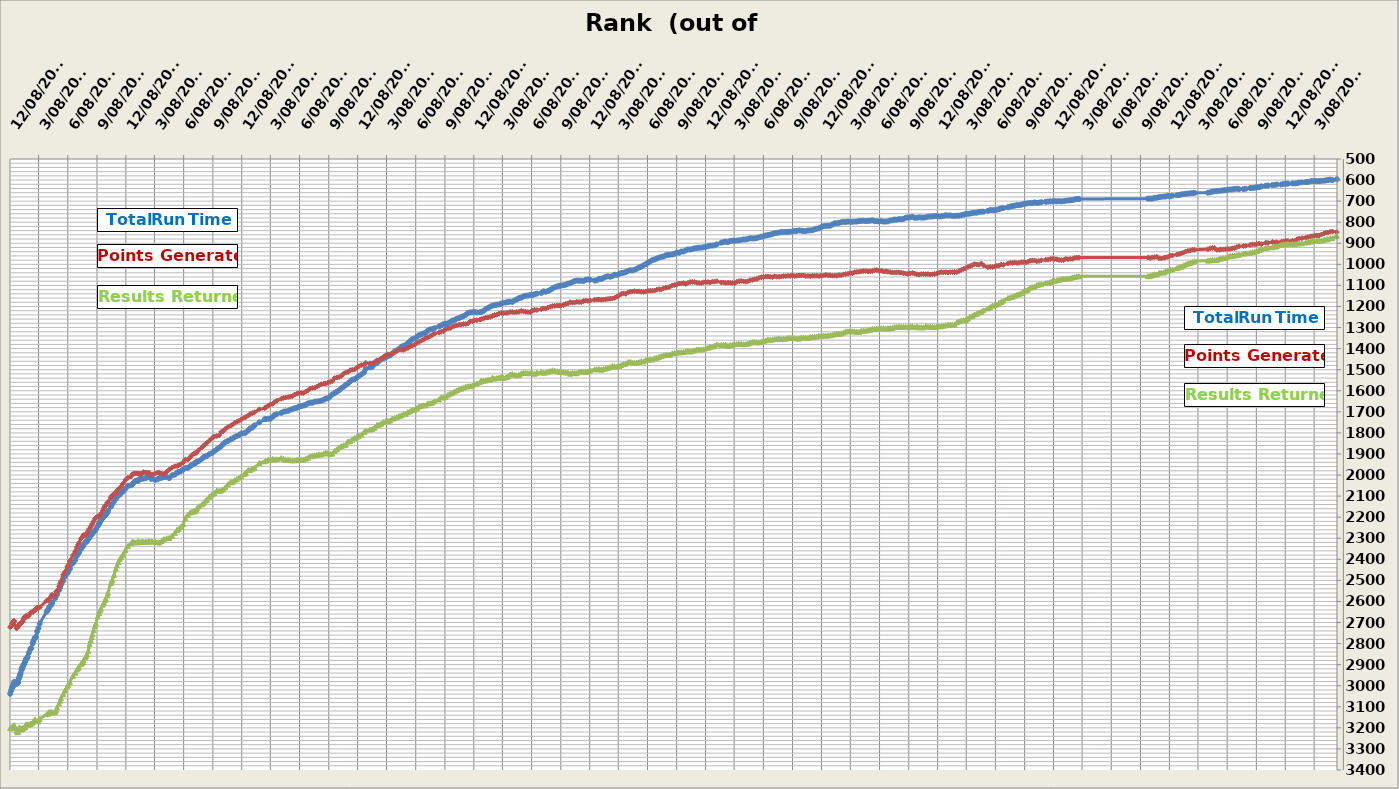
| Category | Series 0 | Series 1 | Series 2 |
|---|---|---|---|
| 2012-12-08 | 3038 | 2722 | 3201 |
| 2012-12-11 | 3024 | 2717 | 3199 |
| 2012-12-13 | 3014 | 2713 | 3202 |
| 2012-12-15 | 3005 | 2705 | 3197 |
| 2012-12-16 | 3003 | 2704 | 3196 |
| 2012-12-17 | 3002 | 2701 | 3196 |
| 2012-12-18 | 2995 | 2697 | 3193 |
| 2012-12-19 | 2992 | 2693 | 3191 |
| 2012-12-20 | 2991 | 2697 | 3190 |
| 2012-12-21 | 2981 | 2693 | 3187 |
| 2012-12-28 | 2992 | 2728 | 3215 |
| 2012-12-31 | 2988 | 2721 | 3220 |
| 2013-01-01 | 2984 | 2722 | 3220 |
| 2013-01-02 | 2983 | 2716 | 3215 |
| 2013-01-04 | 2967 | 2714 | 3202 |
| 2013-01-06 | 2959 | 2710 | 3199 |
| 2013-01-07 | 2957 | 2709 | 3199 |
| 2013-01-08 | 2948 | 2709 | 3201 |
| 2013-01-10 | 2940 | 2701 | 3206 |
| 2013-01-13 | 2924 | 2697 | 3207 |
| 2013-01-14 | 2920 | 2700 | 3206 |
| 2013-01-15 | 2915 | 2699 | 3202 |
| 2013-01-16 | 2912 | 2694 | 3203 |
| 2013-01-19 | 2901 | 2684 | 3199 |
| 2013-01-21 | 2897 | 2675 | 3199 |
| 2013-01-24 | 2887 | 2678 | 3195 |
| 2013-01-25 | 2882 | 2674 | 3195 |
| 2013-01-27 | 2874 | 2669 | 3184 |
| 2013-01-29 | 2871 | 2667 | 3185 |
| 2013-02-01 | 2863 | 2671 | 3183 |
| 2013-02-05 | 2843 | 2668 | 3185 |
| 2013-02-10 | 2825 | 2654 | 3179 |
| 2013-02-12 | 2822 | 2652 | 3181 |
| 2013-02-17 | 2799 | 2651 | 3175 |
| 2013-02-19 | 2788 | 2645 | 3169 |
| 2013-02-23 | 2776 | 2641 | 3163 |
| 2013-02-24 | 2774 | 2639 | 3160 |
| 2013-02-26 | 2769 | 2640 | 3164 |
| 2013-03-03 | 2742 | 2629 | 3167 |
| 2013-03-07 | 2727 | 2630 | 3169 |
| 2013-03-11 | 2705 | 2628 | 3158 |
| 2013-04-02 | 2648 | 2596 | 3135 |
| 2013-04-07 | 2638 | 2595 | 3133 |
| 2013-04-10 | 2628 | 2587 | 3125 |
| 2013-04-16 | 2616 | 2579 | 3124 |
| 2013-04-17 | 2614 | 2575 | 3126 |
| 2013-04-19 | 2607 | 2568 | 3128 |
| 2013-04-29 | 2584 | 2568 | 3124 |
| 2013-05-02 | 2572 | 2554 | 3116 |
| 2013-05-05 | 2566 | 2549 | 3103 |
| 2013-05-11 | 2545 | 2528 | 3085 |
| 2013-05-14 | 2534 | 2516 | 3071 |
| 2013-05-17 | 2521 | 2504 | 3059 |
| 2013-05-24 | 2503 | 2473 | 3040 |
| 2013-05-29 | 2482 | 2461 | 3023 |
| 2013-06-06 | 2467 | 2436 | 3003 |
| 2013-06-09 | 2460 | 2428 | 2995 |
| 2013-06-14 | 2446 | 2407 | 2982 |
| 2013-06-24 | 2418 | 2380 | 2953 |
| 2013-07-01 | 2403 | 2361 | 2938 |
| 2013-07-06 | 2384 | 2343 | 2923 |
| 2013-07-10 | 2374 | 2331 | 2916 |
| 2013-07-13 | 2367 | 2322 | 2909 |
| 2013-07-19 | 2351 | 2302 | 2896 |
| 2013-07-22 | 2344 | 2297 | 2893 |
| 2013-07-25 | 2338 | 2291 | 2888 |
| 2013-07-27 | 2333 | 2285 | 2880 |
| 2013-08-02 | 2318 | 2286 | 2865 |
| 2013-08-04 | 2319 | 2283 | 2859 |
| 2013-08-07 | 2314 | 2275 | 2851 |
| 2013-08-11 | 2304 | 2264 | 2834 |
| 2013-08-15 | 2296 | 2254 | 2802 |
| 2013-08-19 | 2284 | 2246 | 2783 |
| 2013-08-22 | 2282 | 2238 | 2769 |
| 2013-08-24 | 2277 | 2231 | 2755 |
| 2013-08-28 | 2269 | 2220 | 2736 |
| 2013-09-01 | 2266 | 2207 | 2717 |
| 2013-09-04 | 2257 | 2203 | 2704 |
| 2013-09-10 | 2242 | 2196 | 2671 |
| 2013-09-14 | 2232 | 2197 | 2655 |
| 2013-09-17 | 2223 | 2191 | 2643 |
| 2013-09-20 | 2215 | 2183 | 2634 |
| 2013-09-26 | 2204 | 2168 | 2615 |
| 2013-09-29 | 2198 | 2157 | 2606 |
| 2013-10-02 | 2192 | 2148 | 2595 |
| 2013-10-05 | 2189 | 2145 | 2587 |
| 2013-10-10 | 2179 | 2132 | 2571 |
| 2013-10-12 | 2171 | 2129 | 2559 |
| 2013-10-21 | 2150 | 2108 | 2513 |
| 2013-10-23 | 2142 | 2101 | 2505 |
| 2013-10-26 | 2136 | 2098 | 2499 |
| 2013-10-31 | 2125 | 2089 | 2475 |
| 2013-11-06 | 2113 | 2086 | 2444 |
| 2013-11-10 | 2103 | 2073 | 2429 |
| 2013-11-14 | 2097 | 2068 | 2413 |
| 2013-11-18 | 2093 | 2063 | 2399 |
| 2013-11-23 | 2084 | 2054 | 2390 |
| 2013-11-28 | 2079 | 2041 | 2378 |
| 2013-12-06 | 2065 | 2023 | 2356 |
| 2013-12-14 | 2052 | 2013 | 2337 |
| 2013-12-24 | 2048 | 2007 | 2323 |
| 2013-12-28 | 2043 | 1997 | 2316 |
| 2014-01-02 | 2035 | 1992 | 2318 |
| 2014-01-08 | 2027 | 1992 | 2320 |
| 2014-01-14 | 2028 | 1993 | 2314 |
| 2014-01-19 | 2019 | 1992 | 2318 |
| 2014-01-22 | 2020 | 1995 | 2319 |
| 2014-01-27 | 2017 | 1994 | 2316 |
| 2014-02-01 | 2017 | 1986 | 2316 |
| 2014-02-07 | 2015 | 1988 | 2317 |
| 2014-02-12 | 2012 | 1990 | 2317 |
| 2014-02-18 | 2007 | 1989 | 2314 |
| 2014-02-25 | 2018 | 2000 | 2315 |
| 2014-03-01 | 2016 | 1998 | 2316 |
| 2014-03-10 | 2023 | 1993 | 2316 |
| 2014-03-18 | 2020 | 1988 | 2319 |
| 2014-03-23 | 2014 | 1990 | 2320 |
| 2014-03-30 | 2013 | 1993 | 2313 |
| 2014-04-06 | 2010 | 1996 | 2304 |
| 2014-04-15 | 2010 | 1985 | 2300 |
| 2014-04-23 | 2015 | 1974 | 2299 |
| 2014-05-02 | 2001 | 1965 | 2289 |
| 2014-05-11 | 1998 | 1958 | 2274 |
| 2014-05-18 | 1988 | 1957 | 2260 |
| 2014-05-23 | 1986 | 1953 | 2257 |
| 2014-05-29 | 1983 | 1949 | 2247 |
| 2014-06-06 | 1974 | 1939 | 2233 |
| 2014-06-13 | 1967 | 1926 | 2204 |
| 2014-06-21 | 1966 | 1927 | 2189 |
| 2014-06-28 | 1958 | 1915 | 2178 |
| 2014-07-04 | 1951 | 1905 | 2174 |
| 2014-07-10 | 1948 | 1899 | 2172 |
| 2014-07-13 | 1943 | 1897 | 2172 |
| 2014-07-17 | 1939 | 1895 | 2165 |
| 2014-07-20 | 1936 | 1889 | 2157 |
| 2014-07-26 | 1933 | 1880 | 2148 |
| 2014-08-05 | 1922 | 1868 | 2139 |
| 2014-08-10 | 1915 | 1860 | 2131 |
| 2014-08-16 | 1911 | 1851 | 2121 |
| 2014-08-20 | 1909 | 1847 | 2117 |
| 2014-08-28 | 1900 | 1836 | 2103 |
| 2014-09-05 | 1895 | 1825 | 2092 |
| 2014-09-12 | 1887 | 1817 | 2086 |
| 2014-09-20 | 1878 | 1815 | 2073 |
| 2014-09-27 | 1871 | 1812 | 2075 |
| 2014-10-04 | 1862 | 1795 | 2073 |
| 2014-10-10 | 1853 | 1793 | 2068 |
| 2014-10-17 | 1844 | 1780 | 2058 |
| 2014-10-25 | 1838 | 1772 | 2044 |
| 2014-11-03 | 1831 | 1765 | 2032 |
| 2014-11-08 | 1827 | 1761 | 2034 |
| 2014-11-15 | 1820 | 1752 | 2025 |
| 2014-11-22 | 1815 | 1747 | 2019 |
| 2014-11-29 | 1811 | 1743 | 2012 |
| 2014-12-06 | 1803 | 1736 | 2006 |
| 2014-12-16 | 1801 | 1727 | 1995 |
| 2014-12-20 | 1798 | 1725 | 1989 |
| 2014-12-28 | 1788 | 1718 | 1976 |
| 2015-01-03 | 1779 | 1710 | 1976 |
| 2015-01-10 | 1775 | 1706 | 1970 |
| 2015-01-17 | 1764 | 1702 | 1966 |
| 2015-02-01 | 1750 | 1688 | 1943 |
| 2015-02-18 | 1735 | 1683 | 1935 |
| 2015-02-21 | 1734 | 1679 | 1932 |
| 2015-02-28 | 1733 | 1672 | 1927 |
| 2015-03-07 | 1733 | 1666 | 1928 |
| 2015-03-15 | 1724 | 1662 | 1923 |
| 2015-03-21 | 1715 | 1654 | 1926 |
| 2015-03-28 | 1711 | 1647 | 1925 |
| 2015-04-11 | 1705 | 1638 | 1919 |
| 2015-04-18 | 1699 | 1634 | 1923 |
| 2015-04-25 | 1698 | 1632 | 1928 |
| 2015-05-03 | 1695 | 1630 | 1927 |
| 2015-05-09 | 1690 | 1628 | 1929 |
| 2015-05-16 | 1687 | 1626 | 1930 |
| 2015-05-23 | 1683 | 1618 | 1930 |
| 2015-05-30 | 1681 | 1614 | 1927 |
| 2015-06-06 | 1675 | 1611 | 1927 |
| 2015-06-13 | 1673 | 1610 | 1927 |
| 2015-06-20 | 1670 | 1611 | 1926 |
| 2015-06-27 | 1667 | 1604 | 1922 |
| 2015-07-04 | 1660 | 1598 | 1918 |
| 2015-07-11 | 1657 | 1590 | 1911 |
| 2015-07-18 | 1657 | 1587 | 1908 |
| 2015-07-25 | 1652 | 1586 | 1907 |
| 2015-08-01 | 1651 | 1581 | 1905 |
| 2015-08-08 | 1650 | 1575 | 1902 |
| 2015-08-15 | 1647 | 1569 | 1902 |
| 2015-08-23 | 1643 | 1566 | 1898 |
| 2015-08-29 | 1637 | 1566 | 1894 |
| 2015-09-05 | 1636 | 1562 | 1896 |
| 2015-09-12 | 1627 | 1558 | 1900 |
| 2015-09-19 | 1617 | 1554 | 1898 |
| 2015-09-26 | 1612 | 1540 | 1886 |
| 2015-10-03 | 1604 | 1537 | 1878 |
| 2015-10-10 | 1598 | 1535 | 1869 |
| 2015-10-17 | 1588 | 1530 | 1863 |
| 2015-10-24 | 1581 | 1519 | 1859 |
| 2015-10-31 | 1572 | 1513 | 1856 |
| 2015-11-07 | 1565 | 1511 | 1841 |
| 2015-11-14 | 1556 | 1502 | 1839 |
| 2015-11-21 | 1547 | 1500 | 1831 |
| 2015-11-28 | 1545 | 1499 | 1824 |
| 2015-12-05 | 1538 | 1490 | 1819 |
| 2015-12-12 | 1529 | 1483 | 1813 |
| 2015-12-20 | 1522 | 1478 | 1807 |
| 2015-12-28 | 1513 | 1475 | 1796 |
| 2016-01-02 | 1496 | 1468 | 1789 |
| 2016-01-16 | 1489 | 1470 | 1784 |
| 2016-01-23 | 1486 | 1470 | 1781 |
| 2016-01-30 | 1473 | 1464 | 1775 |
| 2016-02-06 | 1469 | 1456 | 1763 |
| 2016-02-13 | 1459 | 1455 | 1761 |
| 2016-02-20 | 1451 | 1447 | 1756 |
| 2016-02-27 | 1446 | 1439 | 1748 |
| 2016-03-05 | 1442 | 1432 | 1744 |
| 2016-03-12 | 1435 | 1427 | 1743 |
| 2016-03-19 | 1432 | 1427 | 1741 |
| 2016-03-26 | 1423 | 1423 | 1732 |
| 2016-04-02 | 1413 | 1419 | 1730 |
| 2016-04-09 | 1408 | 1411 | 1725 |
| 2016-04-16 | 1401 | 1404 | 1720 |
| 2016-04-23 | 1392 | 1405 | 1717 |
| 2016-04-30 | 1386 | 1406 | 1711 |
| 2016-05-07 | 1384 | 1401 | 1710 |
| 2016-05-14 | 1373 | 1397 | 1701 |
| 2016-05-21 | 1364 | 1388 | 1697 |
| 2016-05-28 | 1355 | 1386 | 1690 |
| 2016-06-04 | 1352 | 1381 | 1690 |
| 2016-06-11 | 1344 | 1374 | 1683 |
| 2016-06-18 | 1336 | 1368 | 1675 |
| 2016-06-25 | 1333 | 1362 | 1671 |
| 2016-07-02 | 1328 | 1357 | 1669 |
| 2016-07-09 | 1324 | 1349 | 1669 |
| 2016-07-16 | 1314 | 1347 | 1660 |
| 2016-07-23 | 1309 | 1340 | 1659 |
| 2016-07-30 | 1307 | 1335 | 1656 |
| 2016-08-06 | 1303 | 1329 | 1650 |
| 2016-08-20 | 1295 | 1324 | 1641 |
| 2016-08-27 | 1290 | 1320 | 1631 |
| 2016-09-03 | 1284 | 1317 | 1631 |
| 2016-09-10 | 1282 | 1307 | 1630 |
| 2016-09-17 | 1280 | 1304 | 1619 |
| 2016-09-24 | 1274 | 1303 | 1614 |
| 2016-10-01 | 1267 | 1296 | 1610 |
| 2016-10-08 | 1264 | 1292 | 1603 |
| 2016-10-15 | 1258 | 1289 | 1598 |
| 2016-10-22 | 1255 | 1286 | 1593 |
| 2016-10-29 | 1250 | 1286 | 1590 |
| 2016-11-05 | 1246 | 1283 | 1585 |
| 2016-11-12 | 1240 | 1283 | 1580 |
| 2016-11-19 | 1231 | 1280 | 1579 |
| 2016-11-26 | 1228 | 1271 | 1578 |
| 2016-12-03 | 1227 | 1270 | 1575 |
| 2016-12-10 | 1226 | 1266 | 1569 |
| 2016-12-17 | 1228 | 1265 | 1565 |
| 2016-12-27 | 1227 | 1262 | 1559 |
| 2016-12-31 | 1226 | 1260 | 1552 |
| 2017-01-07 | 1221 | 1257 | 1552 |
| 2017-01-14 | 1213 | 1253 | 1551 |
| 2017-01-21 | 1207 | 1252 | 1547 |
| 2017-01-28 | 1201 | 1250 | 1547 |
| 2017-02-04 | 1196 | 1245 | 1538 |
| 2017-02-11 | 1194 | 1240 | 1542 |
| 2017-02-18 | 1192 | 1239 | 1540 |
| 2017-02-25 | 1190 | 1234 | 1538 |
| 2017-03-04 | 1186 | 1230 | 1535 |
| 2017-03-11 | 1182 | 1232 | 1539 |
| 2017-03-19 | 1181 | 1231 | 1536 |
| 2017-03-25 | 1179 | 1230 | 1532 |
| 2017-04-01 | 1177 | 1226 | 1523 |
| 2017-04-08 | 1178 | 1226 | 1521 |
| 2017-04-15 | 1171 | 1228 | 1524 |
| 2017-04-22 | 1166 | 1226 | 1527 |
| 2017-04-29 | 1160 | 1225 | 1525 |
| 2017-05-06 | 1158 | 1221 | 1518 |
| 2017-05-13 | 1152 | 1223 | 1514 |
| 2017-05-20 | 1149 | 1225 | 1515 |
| 2017-05-27 | 1148 | 1226 | 1517 |
| 2017-06-03 | 1145 | 1227 | 1516 |
| 2017-06-10 | 1146 | 1220 | 1516 |
| 2017-06-17 | 1142 | 1216 | 1519 |
| 2017-06-24 | 1139 | 1217 | 1514 |
| 2017-07-08 | 1136 | 1213 | 1512 |
| 2017-07-15 | 1128 | 1209 | 1514 |
| 2017-07-22 | 1130 | 1210 | 1513 |
| 2017-07-29 | 1127 | 1205 | 1510 |
| 2017-08-05 | 1121 | 1202 | 1507 |
| 2017-08-12 | 1115 | 1198 | 1503 |
| 2017-08-19 | 1109 | 1197 | 1504 |
| 2017-08-26 | 1105 | 1196 | 1508 |
| 2017-09-02 | 1102 | 1196 | 1510 |
| 2017-09-07 | 1101 | 1196 | 1511 |
| 2017-09-16 | 1099 | 1193 | 1511 |
| 2017-09-23 | 1097 | 1188 | 1513 |
| 2017-09-30 | 1092 | 1185 | 1513 |
| 2017-10-07 | 1089 | 1180 | 1519 |
| 2017-10-14 | 1085 | 1181 | 1515 |
| 2017-10-21 | 1079 | 1181 | 1515 |
| 2017-10-28 | 1077 | 1178 | 1517 |
| 2017-11-04 | 1078 | 1179 | 1509 |
| 2017-11-11 | 1078 | 1179 | 1508 |
| 2017-11-18 | 1079 | 1174 | 1510 |
| 2017-11-25 | 1073 | 1172 | 1510 |
| 2017-12-02 | 1072 | 1174 | 1508 |
| 2017-12-09 | 1073 | 1172 | 1504 |
| 2017-12-23 | 1077 | 1168 | 1498 |
| 2017-12-30 | 1076 | 1167 | 1498 |
| 2018-01-06 | 1069 | 1167 | 1497 |
| 2018-01-13 | 1070 | 1168 | 1500 |
| 2018-01-20 | 1064 | 1167 | 1496 |
| 2018-01-27 | 1059 | 1166 | 1494 |
| 2018-02-03 | 1057 | 1164 | 1491 |
| 2018-02-10 | 1059 | 1163 | 1488 |
| 2018-02-17 | 1056 | 1162 | 1482 |
| 2018-02-24 | 1049 | 1159 | 1484 |
| 2018-03-03 | 1050 | 1154 | 1485 |
| 2018-03-10 | 1046 | 1147 | 1483 |
| 2018-03-17 | 1041 | 1140 | 1478 |
| 2018-03-24 | 1040 | 1138 | 1473 |
| 2018-03-31 | 1037 | 1140 | 1471 |
| 2018-04-07 | 1031 | 1133 | 1464 |
| 2018-04-14 | 1028 | 1130 | 1463 |
| 2018-04-21 | 1029 | 1129 | 1466 |
| 2018-04-28 | 1025 | 1127 | 1467 |
| 2018-05-05 | 1021 | 1129 | 1466 |
| 2018-05-12 | 1015 | 1128 | 1464 |
| 2018-05-19 | 1011 | 1130 | 1460 |
| 2018-05-26 | 1005 | 1131 | 1461 |
| 2018-06-02 | 999 | 1129 | 1454 |
| 2018-06-09 | 993 | 1126 | 1453 |
| 2018-06-16 | 986 | 1125 | 1450 |
| 2018-06-23 | 980 | 1125 | 1452 |
| 2018-06-30 | 977 | 1124 | 1445 |
| 2018-07-07 | 972 | 1120 | 1443 |
| 2018-07-14 | 968 | 1118 | 1439 |
| 2018-07-21 | 965 | 1119 | 1436 |
| 2018-07-28 | 963 | 1114 | 1432 |
| 2018-08-04 | 957 | 1111 | 1429 |
| 2018-08-11 | 955 | 1109 | 1430 |
| 2018-08-18 | 954 | 1106 | 1428 |
| 2018-08-25 | 953 | 1100 | 1422 |
| 2018-09-01 | 950 | 1098 | 1421 |
| 2018-09-08 | 944 | 1095 | 1418 |
| 2018-09-15 | 945 | 1091 | 1418 |
| 2018-09-22 | 939 | 1091 | 1417 |
| 2018-09-29 | 939 | 1089 | 1416 |
| 2018-10-06 | 934 | 1093 | 1413 |
| 2018-10-13 | 929 | 1088 | 1411 |
| 2018-10-20 | 930 | 1084 | 1414 |
| 2018-10-27 | 927 | 1083 | 1410 |
| 2018-11-03 | 924 | 1084 | 1408 |
| 2018-11-10 | 923 | 1087 | 1404 |
| 2018-11-17 | 921 | 1088 | 1404 |
| 2018-11-24 | 921 | 1089 | 1404 |
| 2018-12-01 | 919 | 1085 | 1403 |
| 2018-12-08 | 917 | 1085 | 1398 |
| 2018-12-15 | 914 | 1084 | 1396 |
| 2018-12-22 | 911 | 1086 | 1392 |
| 2018-12-29 | 911 | 1082 | 1390 |
| 2019-01-05 | 910 | 1082 | 1387 |
| 2019-01-12 | 905 | 1080 | 1380 |
| 2019-01-26 | 897 | 1086 | 1382 |
| 2019-02-02 | 894 | 1086 | 1383 |
| 2019-02-09 | 892 | 1088 | 1382 |
| 2019-02-16 | 895 | 1087 | 1387 |
| 2019-02-23 | 889 | 1087 | 1383 |
| 2019-03-02 | 888 | 1088 | 1382 |
| 2019-03-09 | 888 | 1090 | 1379 |
| 2019-03-16 | 887 | 1083 | 1378 |
| 2019-03-23 | 886 | 1080 | 1377 |
| 2019-03-30 | 884 | 1079 | 1378 |
| 2019-04-06 | 882 | 1081 | 1379 |
| 2019-04-13 | 882 | 1082 | 1378 |
| 2019-04-20 | 879 | 1080 | 1376 |
| 2019-04-27 | 876 | 1075 | 1372 |
| 2019-05-04 | 877 | 1074 | 1369 |
| 2019-05-11 | 877 | 1071 | 1368 |
| 2019-05-18 | 875 | 1070 | 1370 |
| 2019-05-25 | 872 | 1064 | 1370 |
| 2019-06-01 | 869 | 1061 | 1367 |
| 2019-06-08 | 867 | 1060 | 1363 |
| 2019-06-15 | 863 | 1058 | 1361 |
| 2019-06-22 | 861 | 1058 | 1357 |
| 2019-06-29 | 859 | 1059 | 1358 |
| 2019-07-06 | 856 | 1061 | 1357 |
| 2019-07-13 | 852 | 1057 | 1354 |
| 2019-07-20 | 851 | 1059 | 1354 |
| 2019-07-27 | 849 | 1059 | 1351 |
| 2019-08-03 | 846 | 1058 | 1354 |
| 2019-08-10 | 847 | 1056 | 1352 |
| 2019-08-17 | 846 | 1056 | 1353 |
| 2019-08-24 | 846 | 1055 | 1349 |
| 2019-08-31 | 845 | 1055 | 1349 |
| 2019-09-07 | 844 | 1052 | 1350 |
| 2019-09-14 | 842 | 1056 | 1349 |
| 2019-09-21 | 841 | 1054 | 1352 |
| 2019-09-28 | 839 | 1053 | 1352 |
| 2019-10-05 | 840 | 1053 | 1347 |
| 2019-10-12 | 842 | 1052 | 1348 |
| 2019-10-19 | 842 | 1056 | 1349 |
| 2019-10-26 | 839 | 1055 | 1349 |
| 2019-11-02 | 839 | 1056 | 1345 |
| 2019-11-09 | 838 | 1054 | 1345 |
| 2019-11-16 | 834 | 1054 | 1343 |
| 2019-11-23 | 831 | 1054 | 1343 |
| 2019-11-30 | 829 | 1056 | 1340 |
| 2019-12-07 | 823 | 1053 | 1340 |
| 2019-12-14 | 819 | 1053 | 1337 |
| 2019-12-21 | 818 | 1050 | 1339 |
| 2019-12-28 | 817 | 1052 | 1337 |
| 2020-01-04 | 817 | 1052 | 1337 |
| 2020-01-11 | 811 | 1054 | 1334 |
| 2020-01-18 | 805 | 1053 | 1332 |
| 2020-01-25 | 805 | 1054 | 1329 |
| 2020-02-01 | 803 | 1051 | 1330 |
| 2020-02-08 | 800 | 1052 | 1328 |
| 2020-02-15 | 798 | 1048 | 1323 |
| 2020-02-22 | 799 | 1046 | 1318 |
| 2020-02-29 | 797 | 1045 | 1318 |
| 2020-03-07 | 798 | 1041 | 1316 |
| 2020-03-14 | 798 | 1042 | 1318 |
| 2020-03-21 | 797 | 1037 | 1318 |
| 2020-03-28 | 797 | 1036 | 1320 |
| 2020-04-04 | 795 | 1035 | 1321 |
| 2020-04-11 | 794 | 1034 | 1315 |
| 2020-04-18 | 793 | 1032 | 1314 |
| 2020-04-25 | 795 | 1031 | 1314 |
| 2020-05-02 | 794 | 1034 | 1313 |
| 2020-05-09 | 793 | 1033 | 1311 |
| 2020-05-16 | 791 | 1032 | 1306 |
| 2020-05-23 | 795 | 1028 | 1306 |
| 2020-05-30 | 795 | 1027 | 1305 |
| 2020-06-06 | 797 | 1031 | 1304 |
| 2020-06-13 | 795 | 1030 | 1303 |
| 2020-06-20 | 797 | 1034 | 1303 |
| 2020-06-27 | 797 | 1033 | 1305 |
| 2020-07-04 | 796 | 1035 | 1303 |
| 2020-07-11 | 792 | 1037 | 1303 |
| 2020-07-18 | 791 | 1039 | 1302 |
| 2020-07-25 | 787 | 1039 | 1297 |
| 2020-08-01 | 788 | 1038 | 1297 |
| 2020-08-08 | 785 | 1038 | 1296 |
| 2020-08-15 | 786 | 1039 | 1297 |
| 2020-08-22 | 784 | 1042 | 1296 |
| 2020-08-29 | 779 | 1044 | 1297 |
| 2020-09-05 | 778 | 1045 | 1298 |
| 2020-09-12 | 777 | 1043 | 1296 |
| 2020-09-19 | 774 | 1041 | 1294 |
| 2020-09-26 | 779 | 1044 | 1298 |
| 2020-10-03 | 779 | 1047 | 1295 |
| 2020-10-10 | 777 | 1049 | 1299 |
| 2020-10-17 | 778 | 1046 | 1298 |
| 2020-10-24 | 778 | 1046 | 1299 |
| 2020-10-31 | 777 | 1047 | 1294 |
| 2020-11-07 | 774 | 1046 | 1296 |
| 2020-11-14 | 773 | 1048 | 1295 |
| 2020-11-21 | 773 | 1047 | 1297 |
| 2020-11-28 | 771 | 1046 | 1298 |
| 2020-12-05 | 771 | 1043 | 1296 |
| 2020-12-12 | 773 | 1040 | 1294 |
| 2020-12-19 | 772 | 1037 | 1294 |
| 2020-12-26 | 771 | 1038 | 1291 |
| 2021-01-02 | 767 | 1037 | 1289 |
| 2021-01-09 | 768 | 1039 | 1286 |
| 2021-01-16 | 768 | 1037 | 1286 |
| 2021-01-23 | 770 | 1037 | 1286 |
| 2021-01-30 | 770 | 1036 | 1285 |
| 2021-02-06 | 769 | 1037 | 1275 |
| 2021-02-13 | 769 | 1032 | 1271 |
| 2021-02-20 | 767 | 1026 | 1267 |
| 2021-02-27 | 764 | 1022 | 1265 |
| 2021-03-06 | 761 | 1018 | 1265 |
| 2021-03-13 | 760 | 1012 | 1258 |
| 2021-03-20 | 759 | 1008 | 1248 |
| 2021-03-27 | 756 | 1004 | 1245 |
| 2021-04-03 | 755 | 999 | 1238 |
| 2021-04-10 | 755 | 1001 | 1234 |
| 2021-04-17 | 751 | 1002 | 1228 |
| 2021-04-24 | 750 | 996 | 1225 |
| 2021-05-01 | 750 | 1005 | 1218 |
| 2021-05-15 | 746 | 1014 | 1209 |
| 2021-05-22 | 742 | 1012 | 1203 |
| 2021-05-29 | 743 | 1013 | 1196 |
| 2021-06-05 | 743 | 1010 | 1193 |
| 2021-06-12 | 741 | 1007 | 1191 |
| 2021-06-19 | 738 | 1006 | 1183 |
| 2021-06-26 | 734 | 1001 | 1178 |
| 2021-07-03 | 733 | 1002 | 1172 |
| 2021-07-17 | 729 | 996 | 1160 |
| 2021-07-24 | 726 | 993 | 1157 |
| 2021-07-31 | 723 | 993 | 1154 |
| 2021-08-07 | 722 | 991 | 1149 |
| 2021-08-14 | 719 | 994 | 1144 |
| 2021-08-21 | 719 | 993 | 1141 |
| 2021-08-28 | 717 | 990 | 1137 |
| 2021-09-04 | 713 | 990 | 1128 |
| 2021-09-11 | 712 | 991 | 1124 |
| 2021-09-18 | 710 | 988 | 1120 |
| 2021-09-25 | 709 | 983 | 1110 |
| 2021-10-02 | 709 | 982 | 1109 |
| 2021-10-09 | 706 | 982 | 1105 |
| 2021-10-16 | 708 | 985 | 1098 |
| 2021-10-23 | 707 | 984 | 1096 |
| 2021-10-30 | 705 | 981 | 1094 |
| 2021-11-13 | 703 | 978 | 1089 |
| 2021-11-20 | 702 | 978 | 1088 |
| 2021-11-27 | 701 | 975 | 1085 |
| 2021-12-04 | 701 | 973 | 1079 |
| 2021-12-11 | 700 | 975 | 1079 |
| 2021-12-18 | 701 | 976 | 1075 |
| 2021-12-25 | 700 | 979 | 1073 |
| 2022-01-01 | 701 | 980 | 1070 |
| 2022-01-08 | 700 | 980 | 1068 |
| 2022-01-15 | 698 | 974 | 1067 |
| 2022-01-22 | 697 | 976 | 1067 |
| 2022-01-29 | 696 | 974 | 1066 |
| 2022-02-05 | 695 | 974 | 1062 |
| 2022-02-12 | 692 | 969 | 1060 |
| 2022-02-19 | 690 | 968 | 1057 |
| 2022-02-26 | 690 | 968 | 1057 |
| 2022-10-01 | 688 | 968 | 1056 |
| 2022-10-08 | 688 | 970 | 1055 |
| 2022-10-15 | 688 | 967 | 1051 |
| 2022-10-22 | 684 | 966 | 1047 |
| 2022-10-29 | 684 | 964 | 1048 |
| 2022-11-05 | 681 | 971 | 1040 |
| 2022-11-12 | 680 | 972 | 1039 |
| 2022-11-21 | 678 | 969 | 1038 |
| 2022-11-26 | 678 | 967 | 1033 |
| 2022-12-03 | 675 | 965 | 1030 |
| 2022-12-10 | 677 | 959 | 1025 |
| 2022-12-17 | 674 | 958 | 1024 |
| 2022-12-31 | 672 | 953 | 1018 |
| 2023-01-07 | 671 | 951 | 1014 |
| 2023-01-14 | 668 | 948 | 1011 |
| 2023-01-21 | 667 | 944 | 1005 |
| 2023-01-28 | 665 | 939 | 1000 |
| 2023-02-04 | 664 | 936 | 996 |
| 2023-02-11 | 663 | 935 | 993 |
| 2023-02-18 | 662 | 931 | 989 |
| 2023-02-25 | 661 | 931 | 985 |
| 2023-04-08 | 660 | 928 | 982 |
| 2023-04-15 | 658 | 924 | 981 |
| 2023-04-22 | 655 | 923 | 979 |
| 2023-04-29 | 653 | 923 | 979 |
| 2023-05-06 | 653 | 931 | 979 |
| 2023-05-14 | 651 | 931 | 974 |
| 2023-05-20 | 650 | 929 | 972 |
| 2023-05-27 | 649 | 929 | 970 |
| 2023-06-03 | 648 | 928 | 969 |
| 2023-06-10 | 646 | 927 | 963 |
| 2023-06-17 | 645 | 927 | 960 |
| 2023-06-24 | 644 | 924 | 959 |
| 2023-07-01 | 642 | 923 | 958 |
| 2023-07-08 | 641 | 918 | 956 |
| 2023-07-15 | 643 | 914 | 954 |
| 2023-07-29 | 643 | 913 | 949 |
| 2023-08-05 | 641 | 912 | 947 |
| 2023-08-19 | 638 | 908 | 945 |
| 2023-08-26 | 638 | 905 | 942 |
| 2023-09-02 | 636 | 906 | 940 |
| 2023-09-09 | 634 | 904 | 937 |
| 2023-09-16 | 634 | 901 | 932 |
| 2023-09-23 | 630 | 904 | 929 |
| 2023-10-07 | 627 | 897 | 922 |
| 2023-10-14 | 626 | 898 | 920 |
| 2023-10-28 | 624 | 894 | 919 |
| 2023-11-04 | 623 | 896 | 916 |
| 2023-11-11 | 621 | 895 | 915 |
| 2023-11-25 | 621 | 893 | 906 |
| 2023-12-02 | 618 | 891 | 904 |
| 2023-12-09 | 617 | 888 | 904 |
| 2023-12-16 | 617 | 889 | 902 |
| 2023-12-30 | 616 | 888 | 903 |
| 2024-01-07 | 616 | 887 | 903 |
| 2024-01-14 | 615 | 881 | 901 |
| 2024-01-20 | 612 | 878 | 900 |
| 2024-01-29 | 611 | 876 | 900 |
| 2024-02-10 | 610 | 873 | 896 |
| 2024-02-17 | 609 | 871 | 895 |
| 2024-02-25 | 606 | 867 | 892 |
| 2024-03-02 | 605 | 867 | 889 |
| 2024-03-09 | 605 | 863 | 888 |
| 2024-03-16 | 605 | 863 | 888 |
| 2024-03-23 | 605 | 863 | 888 |
| 2024-03-30 | 604 | 859 | 887 |
| 2024-04-08 | 603 | 853 | 883 |
| 2024-04-15 | 601 | 849 | 881 |
| 2024-04-20 | 600 | 849 | 880 |
| 2024-04-27 | 598 | 845 | 876 |
| 2024-05-04 | 600 | 844 | 876 |
| 2024-05-18 | 596 | 847 | 865 |